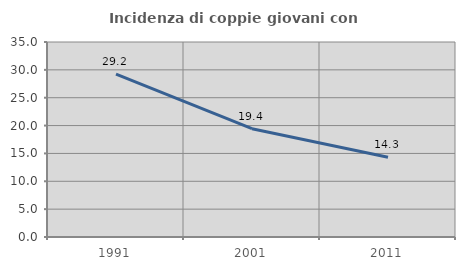
| Category | Incidenza di coppie giovani con figli |
|---|---|
| 1991.0 | 29.231 |
| 2001.0 | 19.442 |
| 2011.0 | 14.319 |